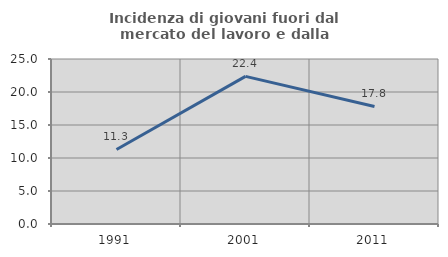
| Category | Incidenza di giovani fuori dal mercato del lavoro e dalla formazione  |
|---|---|
| 1991.0 | 11.29 |
| 2001.0 | 22.371 |
| 2011.0 | 17.811 |